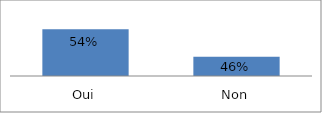
| Category | Series 0 |
|---|---|
| Oui | 0.542 |
| Non | 0.458 |